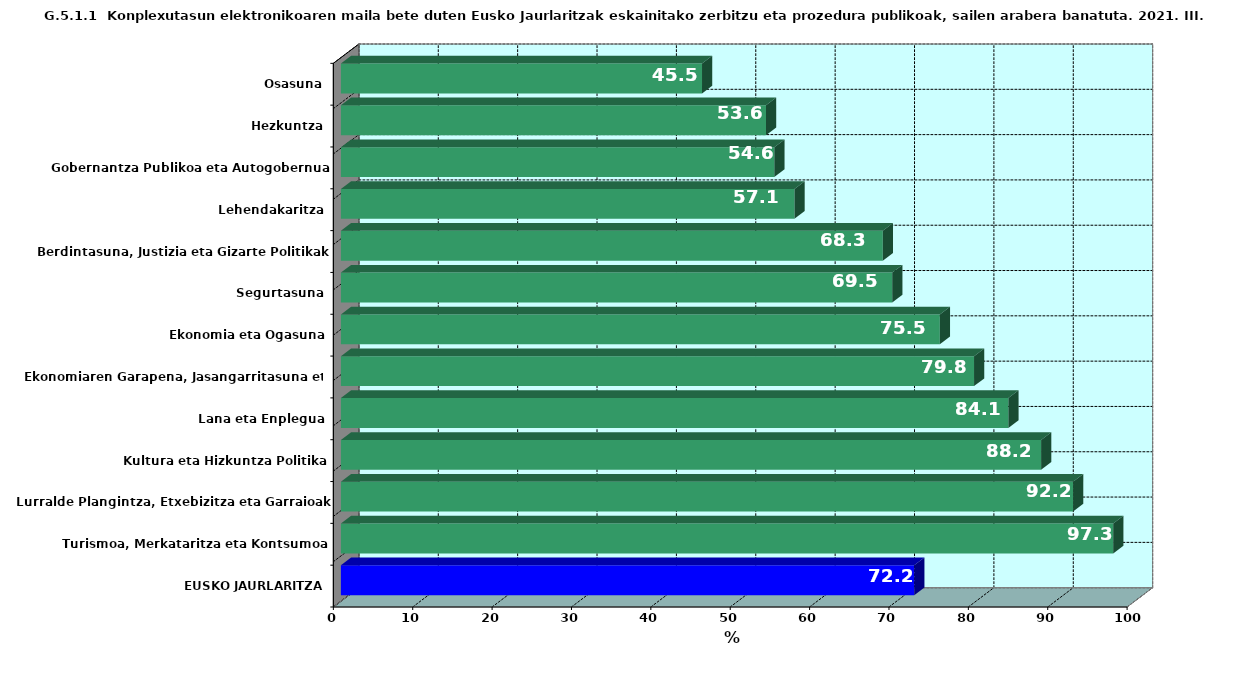
| Category | Series 0 |
|---|---|
| EUSKO JAURLARITZA | 72.23 |
| Turismoa, Merkataritza eta Kontsumoa | 97.297 |
| Lurralde Plangintza, Etxebizitza eta Garraioak | 92.241 |
| Kultura eta Hizkuntza Politika | 88.214 |
| Lana eta Enplegua | 84.091 |
| Ekonomiaren Garapena, Jasangarritasuna eta Ingurumena | 79.765 |
| Ekonomia eta Ogasuna | 75.455 |
| Segurtasuna | 69.458 |
| Berdintasuna, Justizia eta Gizarte Politikak | 68.269 |
| Lehendakaritza | 57.143 |
| Gobernantza Publikoa eta Autogobernua | 54.605 |
| Hezkuntza | 53.556 |
| Osasuna | 45.495 |